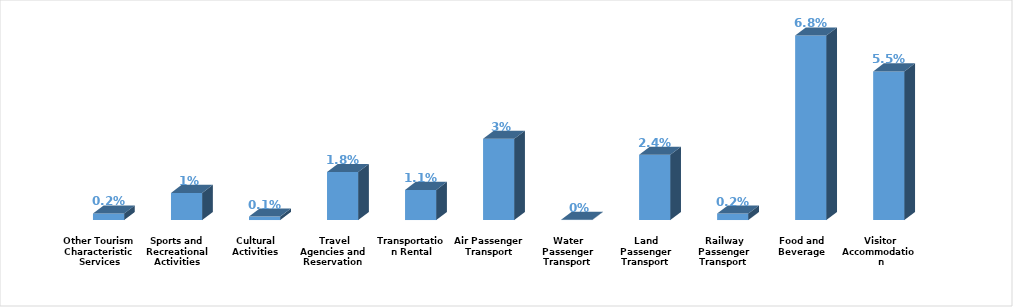
| Category | Series 0 |
|---|---|
| Visitor Accommodation | 0.055 |
| Food and Beverage | 0.068 |
| Railway Passenger Transport | 0.002 |
| Land Passenger Transport | 0.024 |
| Water Passenger Transport | 0 |
| Air Passenger Transport | 0.03 |
| Transportation Rental | 0.011 |
| Travel Agencies and Reservation Services  | 0.018 |
| Cultural Activities | 0.001 |
| Sports and Recreational Activities | 0.01 |
| Other Tourism Characteristic Services | 0.002 |